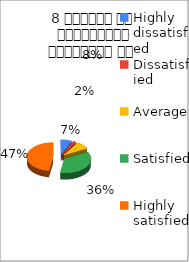
| Category | 8 शिक्षक का सम्प्रेषण सुस्पष्ठ है  |
|---|---|
| Highly dissatisfied | 4 |
| Dissatisfied | 1 |
| Average | 5 |
| Satisfied | 21 |
| Highly satisfied | 28 |